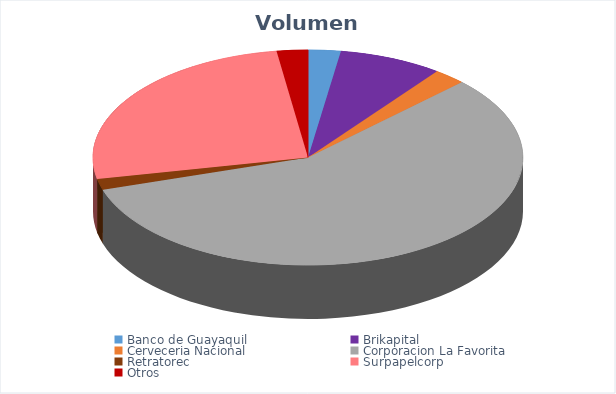
| Category | VOLUMEN ($USD) |
|---|---|
| Banco de Guayaquil | 9441.72 |
| Brikapital | 30000 |
| Cerveceria Nacional | 9500 |
| Corporacion La Favorita | 221972.4 |
| Retratorec | 6300 |
| Surpapelcorp | 100002.5 |
| Otros | 9006.9 |